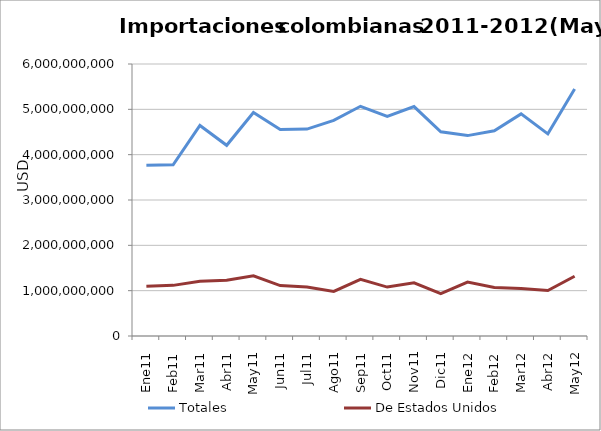
| Category | Totales | De Estados Unidos |
|---|---|---|
| 0 | 3769071385.83 | 1096573432.67 |
| 1 | 3775564052.22 | 1116827967.7 |
| 2 | 4644660120.9 | 1207611145.24 |
| 3 | 4206223566.77 | 1228593617.79 |
| 4 | 4931275219.16 | 1329185657.56 |
| 5 | 4552700270.25 | 1112850981.19 |
| 6 | 4564257940.31 | 1081734647.48 |
| 7 | 4756833171.22 | 983823036.37 |
| 8 | 5067096495.66 | 1249083768.62 |
| 9 | 4842017640.09 | 1079027571.65 |
| 10 | 5060493820.5 | 1171619158.82 |
| 11 | 4504628481.45 | 936650169.29 |
| 12 | 4420536163.16 | 1189511680.79 |
| 13 | 4528063830.69 | 1072056937.03 |
| 14 | 4899682643.41 | 1049688546.32 |
| 15 | 4458717024.33 | 1004044482.74 |
| 16 | 5446678318.48 | 1318729624.07 |